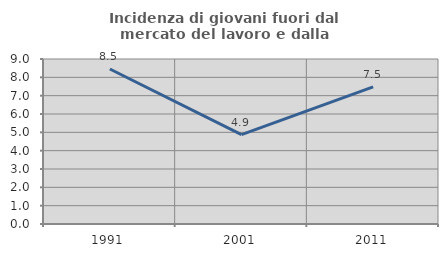
| Category | Incidenza di giovani fuori dal mercato del lavoro e dalla formazione  |
|---|---|
| 1991.0 | 8.455 |
| 2001.0 | 4.878 |
| 2011.0 | 7.483 |